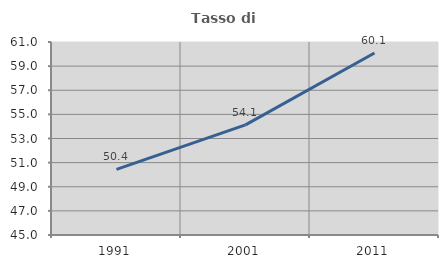
| Category | Tasso di occupazione   |
|---|---|
| 1991.0 | 50.446 |
| 2001.0 | 54.125 |
| 2011.0 | 60.092 |